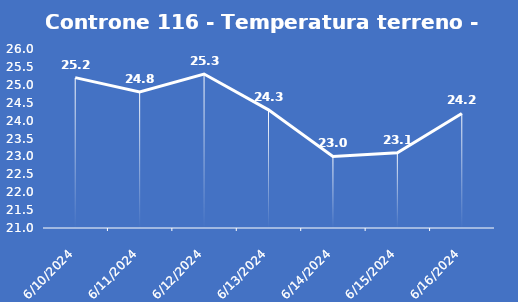
| Category | Controne 116 - Temperatura terreno - Grezzo (°C) |
|---|---|
| 6/10/24 | 25.2 |
| 6/11/24 | 24.8 |
| 6/12/24 | 25.3 |
| 6/13/24 | 24.3 |
| 6/14/24 | 23 |
| 6/15/24 | 23.1 |
| 6/16/24 | 24.2 |